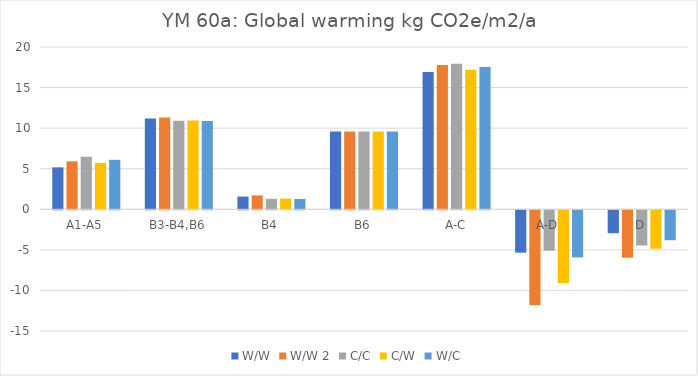
| Category | W/W | W/W 2 | C/C | C/W | W/C |
|---|---|---|---|---|---|
| A1-A5 | 5.17 | 5.9 | 6.48 | 5.72 | 6.1 |
| B3-B4,B6 | 11.18 | 11.32 | 10.9 | 10.93 | 10.88 |
| B4 | 1.57 | 1.71 | 1.29 | 1.32 | 1.27 |
| B6 | 9.58 | 9.58 | 9.58 | 9.58 | 9.58 |
| A-C | 16.91 | 17.78 | 17.94 | 17.21 | 17.54 |
| A-D | -5.22 | -11.71 | -4.98 | -9 | -5.81 |
| D | -2.83 | -5.84 | -4.34 | -4.74 | -3.69 |